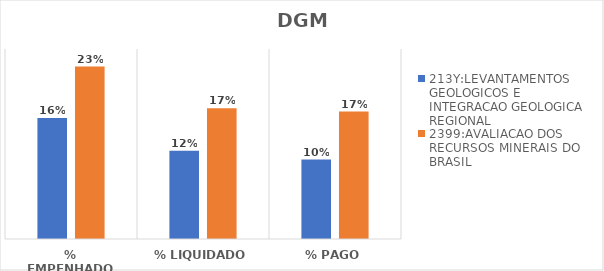
| Category | 213Y:LEVANTAMENTOS GEOLOGICOS E INTEGRACAO GEOLOGICA REGIONAL | 2399:AVALIACAO DOS RECURSOS MINERAIS DO BRASIL |
|---|---|---|
| % EMPENHADO | 0.159 | 0.227 |
| % LIQUIDADO | 0.116 | 0.172 |
| % PAGO | 0.105 | 0.168 |